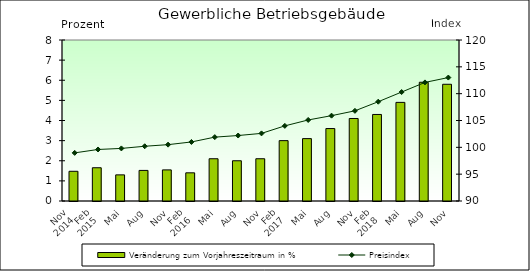
| Category | Veränderung zum Vorjahreszeitraum in % |
|---|---|
| 0 | 1.476 |
| 1 | 1.653 |
| 2 | 1.299 |
| 3 | 1.519 |
| 4 | 1.546 |
| 5 | 1.4 |
| 6 | 2.1 |
| 7 | 2 |
| 8 | 2.1 |
| 9 | 3 |
| 10 | 3.1 |
| 11 | 3.6 |
| 12 | 4.1 |
| 13 | 4.3 |
| 14 | 4.9 |
| 15 | 5.9 |
| 16 | 5.8 |